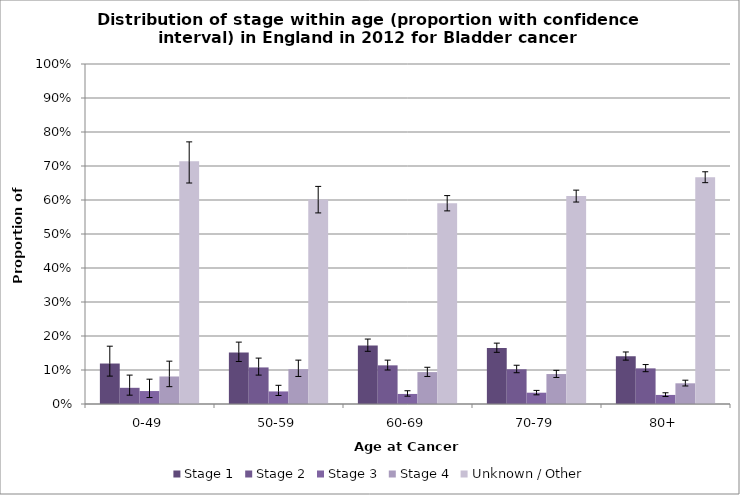
| Category | Stage 1 | Stage 2 | Stage 3 | Stage 4 | Unknown / Other |
|---|---|---|---|---|---|
| 0-49 | 0.119 | 0.048 | 0.038 | 0.081 | 0.714 |
| 50-59 | 0.151 | 0.108 | 0.037 | 0.103 | 0.602 |
| 60-69 | 0.172 | 0.114 | 0.03 | 0.094 | 0.591 |
| 70-79 | 0.165 | 0.102 | 0.033 | 0.088 | 0.612 |
| 80+ | 0.141 | 0.105 | 0.027 | 0.061 | 0.667 |